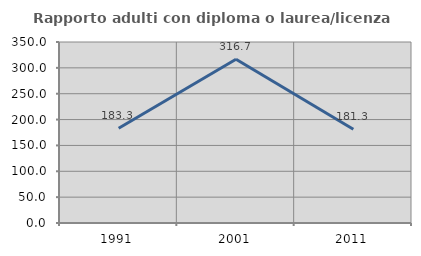
| Category | Rapporto adulti con diploma o laurea/licenza media  |
|---|---|
| 1991.0 | 183.333 |
| 2001.0 | 316.667 |
| 2011.0 | 181.25 |